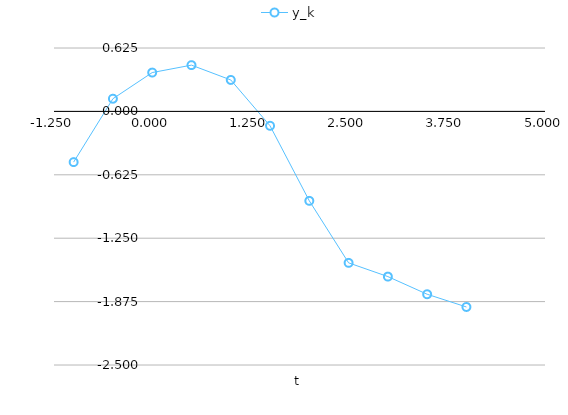
| Category | y_k |
|---|---|
| -1.0 | -0.5 |
| -0.5 | 0.125 |
| 0.0 | 0.383 |
| 0.5 | 0.456 |
| 1.0 | 0.31 |
| 1.5 | -0.142 |
| 2.0 | -0.882 |
| 2.5 | -1.493 |
| 3.0 | -1.628 |
| 3.5 | -1.803 |
| 4.0 | -1.928 |